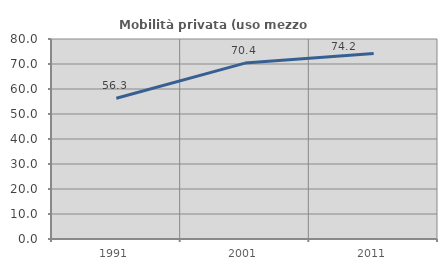
| Category | Mobilità privata (uso mezzo privato) |
|---|---|
| 1991.0 | 56.312 |
| 2001.0 | 70.366 |
| 2011.0 | 74.214 |